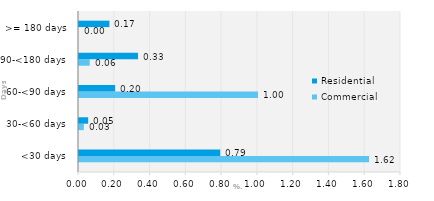
| Category | Commercial | Residential |
|---|---|---|
| <30 days | 1.621 | 0.79 |
| 30-<60 days | 0.027 | 0.051 |
| 60-<90 days | 1 | 0.202 |
| 90-<180 days | 0.06 | 0.33 |
| >= 180 days | 0 | 0.17 |